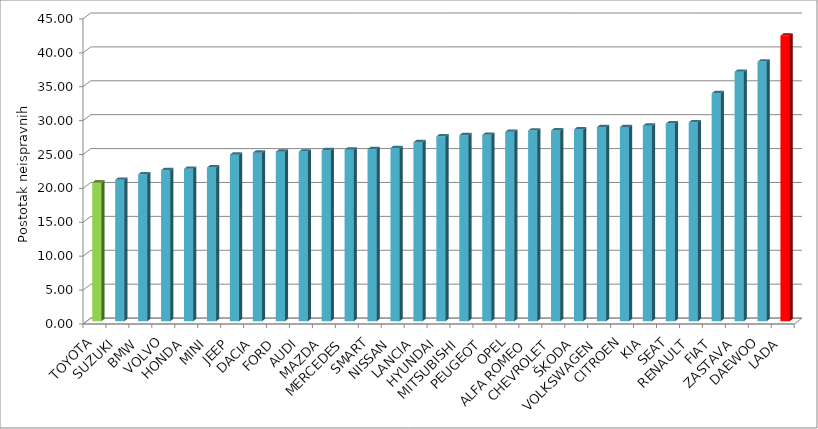
| Category | Series 4 |
|---|---|
| TOYOTA | 20.462 |
| SUZUKI | 20.854 |
| BMW | 21.662 |
| VOLVO | 22.275 |
| HONDA | 22.471 |
| MINI | 22.679 |
| JEEP | 24.569 |
| DACIA | 24.856 |
| FORD | 24.999 |
| AUDI | 25.015 |
| MAZDA | 25.231 |
| MERCEDES | 25.296 |
| SMART | 25.374 |
| NISSAN | 25.546 |
| LANCIA | 26.395 |
| HYUNDAI | 27.264 |
| MITSUBISHI | 27.434 |
| PEUGEOT | 27.487 |
| OPEL | 27.929 |
| ALFA ROMEO | 28.122 |
| CHEVROLET | 28.13 |
| ŠKODA | 28.291 |
| VOLKSWAGEN | 28.628 |
| CITROEN | 28.63 |
| KIA | 28.846 |
| SEAT | 29.162 |
| RENAULT | 29.34 |
| FIAT | 33.629 |
| ZASTAVA | 36.794 |
| DAEWOO | 38.29 |
| LADA | 42.125 |